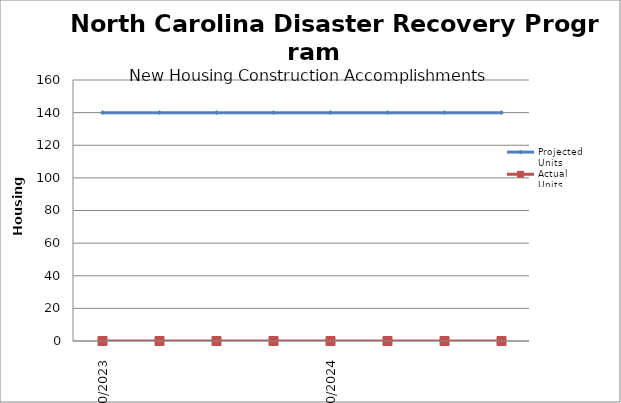
| Category | Projected Units | Actual Units |
|---|---|---|
| 10/2023 | 140 | 0 |
| 01/2024 | 140 | 0 |
| 4/2024 | 140 | 0 |
| 07/2024 | 140 | 0 |
| 10/2024 | 140 | 0 |
| 01/2025 | 140 | 0 |
| 4/2025 | 140 | 0 |
| 07/2025 | 140 | 0 |